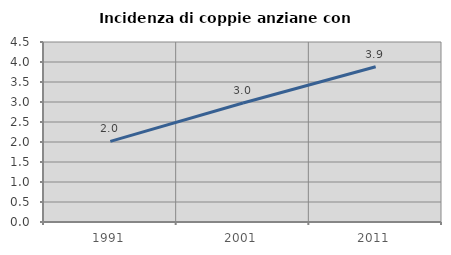
| Category | Incidenza di coppie anziane con figli |
|---|---|
| 1991.0 | 2.016 |
| 2001.0 | 2.974 |
| 2011.0 | 3.883 |